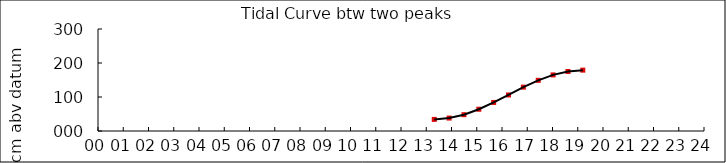
| Category | Height cm |
|---|---|
| 13.31666666666667 | 34.137 |
| 13.905 | 38 |
| 14.49333333333333 | 48 |
| 15.08166666666667 | 64 |
| 15.67 | 84 |
| 16.25833333333333 | 106 |
| 16.84666666666667 | 129 |
| 17.435 | 149 |
| 18.02333333333333 | 165 |
| 18.61166666666667 | 175 |
| 19.2 | 179 |